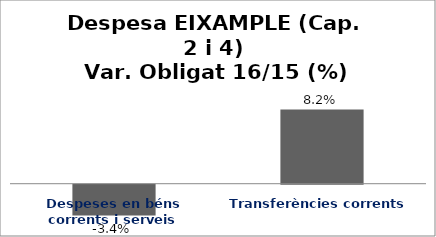
| Category | Series 0 |
|---|---|
| Despeses en béns corrents i serveis | -0.034 |
| Transferències corrents | 0.082 |